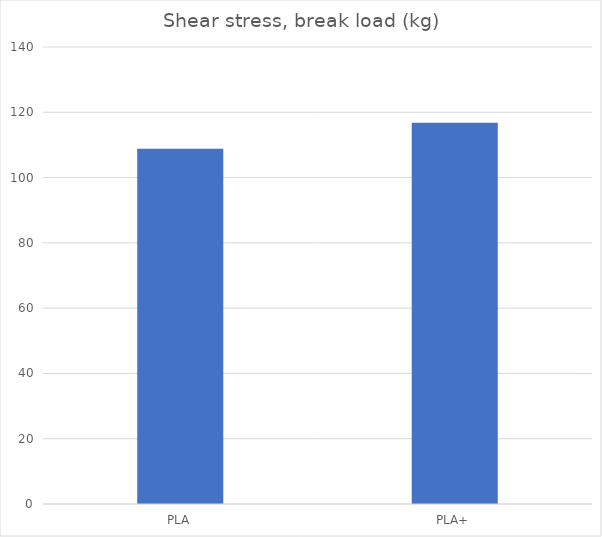
| Category | Break kg |
|---|---|
| PLA | 108.8 |
| PLA+ | 116.8 |